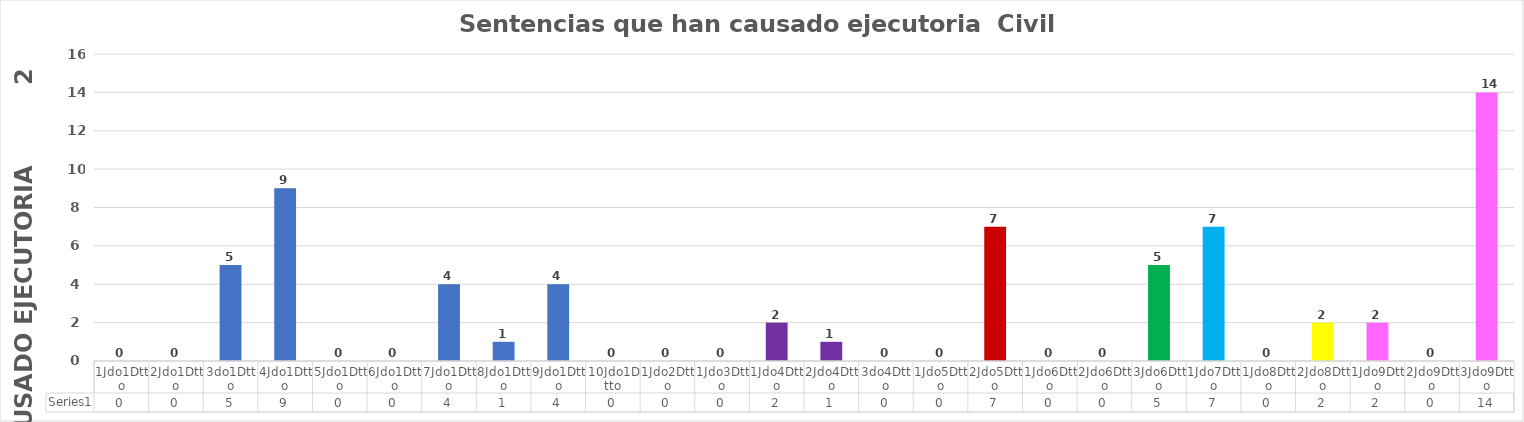
| Category | Series 0 |
|---|---|
| 1Jdo1Dtto | 0 |
| 2Jdo1Dtto | 0 |
| 3do1Dtto | 5 |
| 4Jdo1Dtto | 9 |
| 5Jdo1Dtto | 0 |
| 6Jdo1Dtto | 0 |
| 7Jdo1Dtto | 4 |
| 8Jdo1Dtto | 1 |
| 9Jdo1Dtto | 4 |
| 10Jdo1Dtto | 0 |
| 1Jdo2Dtto | 0 |
| 1Jdo3Dtto | 0 |
| 1Jdo4Dtto | 2 |
| 2Jdo4Dtto | 1 |
| 3do4Dtto | 0 |
| 1Jdo5Dtto | 0 |
| 2Jdo5Dtto | 7 |
| 1Jdo6Dtto | 0 |
| 2Jdo6Dtto | 0 |
| 3Jdo6Dtto | 5 |
| 1Jdo7Dtto | 7 |
| 1Jdo8Dtto | 0 |
| 2Jdo8Dtto | 2 |
| 1Jdo9Dtto | 2 |
| 2Jdo9Dtto | 0 |
| 3Jdo9Dtto | 14 |